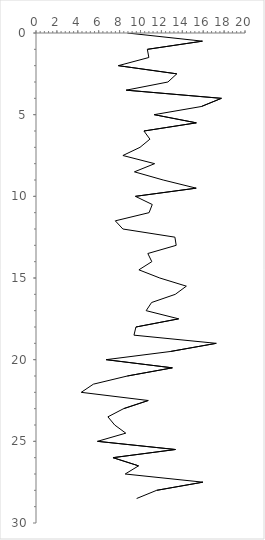
| Category | Series 0 |
|---|---|
| 8.74427058637585 | 0 |
| 15.925925925925926 | 0.5 |
| 10.656036114751712 | 1 |
| 10.79916815210933 | 1.5 |
| 7.876984126984127 | 2 |
| 13.47462061747776 | 2.5 |
| 12.62391233867244 | 3 |
| 8.631324715040313 | 3.5 |
| 17.74151774151774 | 4 |
| 15.825825825825826 | 4.5 |
| 11.307506053268765 | 5 |
| 15.341501197014503 | 5.5 |
| 10.329331162664497 | 6 |
| 10.900673400673403 | 6.5 |
| 9.95266323583697 | 7 |
| 8.316280441715982 | 7.5 |
| 11.354458262585473 | 8 |
| 9.419191919191919 | 8.5 |
| 12.171717171717171 | 9 |
| 15.331439393939396 | 9.5 |
| 9.511784511784512 | 10 |
| 11.125541125541126 | 10.5 |
| 10.821540329737052 | 11 |
| 7.588838838838839 | 11.5 |
| 8.314058458985995 | 12 |
| 13.293650793650793 | 12.5 |
| 13.415159345391904 | 13 |
| 10.70242656449553 | 13.5 |
| 11.0838954920227 | 14 |
| 9.847494553376906 | 14.5 |
| 11.847214603031183 | 15 |
| 14.387464387464385 | 15.5 |
| 13.328047921071176 | 16 |
| 11.06106106106106 | 16.5 |
| 10.541310541310542 | 17 |
| 13.650793650793652 | 17.5 |
| 9.562289562289562 | 18 |
| 9.375724457691671 | 18.5 |
| 17.249417249417252 | 19 |
| 12.85231456334118 | 19.5 |
| 6.707226869355325 | 20 |
| 13.048589640825986 | 20.5 |
| 8.736824769433467 | 21 |
| 5.493265637120089 | 21.5 |
| 4.328165374677003 | 22 |
| 10.740409016271085 | 22.5 |
| 8.382421692379616 | 23 |
| 6.881408246532726 | 23.5 |
| 7.530864197530865 | 24 |
| 8.592592592592592 | 24.5 |
| 5.882473479295723 | 25 |
| 13.343965975544924 | 25.5 |
| 7.367003367003368 | 26 |
| 9.814814814814815 | 26.5 |
| 8.535808535808536 | 27 |
| 15.969215969215972 | 27.5 |
| 11.543715846994536 | 28 |
| 9.62962962962963 | 28.5 |